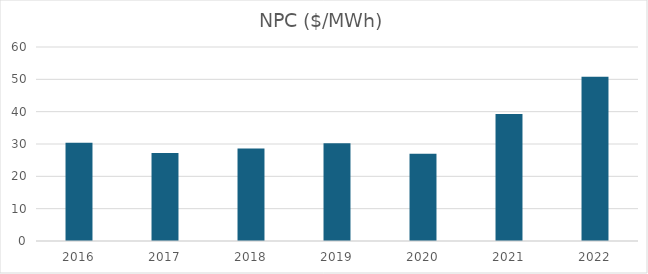
| Category | NPC ($/MWh) |
|---|---|
| 2016.0 | 30.35 |
| 2017.0 | 27.2 |
| 2018.0 | 28.58 |
| 2019.0 | 30.25 |
| 2020.0 | 26.96 |
| 2021.0 | 39.24 |
| 2022.0 | 50.81 |